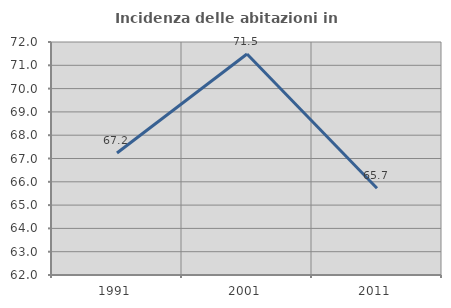
| Category | Incidenza delle abitazioni in proprietà  |
|---|---|
| 1991.0 | 67.233 |
| 2001.0 | 71.483 |
| 2011.0 | 65.721 |